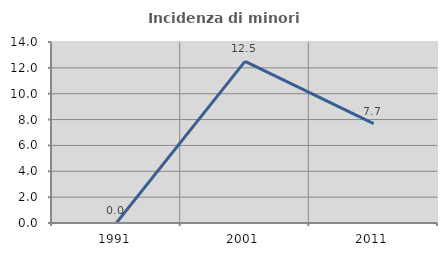
| Category | Incidenza di minori stranieri |
|---|---|
| 1991.0 | 0 |
| 2001.0 | 12.5 |
| 2011.0 | 7.692 |